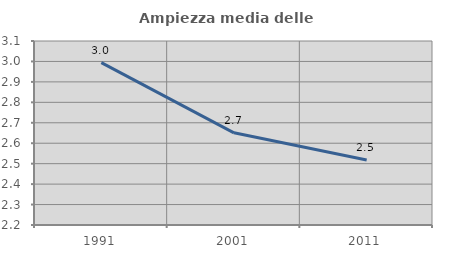
| Category | Ampiezza media delle famiglie |
|---|---|
| 1991.0 | 2.994 |
| 2001.0 | 2.651 |
| 2011.0 | 2.518 |